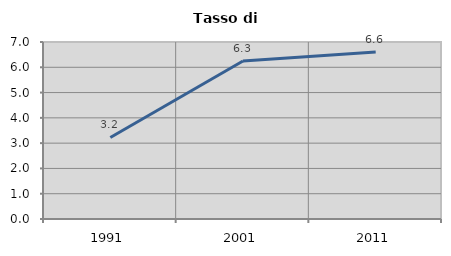
| Category | Tasso di disoccupazione   |
|---|---|
| 1991.0 | 3.226 |
| 2001.0 | 6.25 |
| 2011.0 | 6.604 |